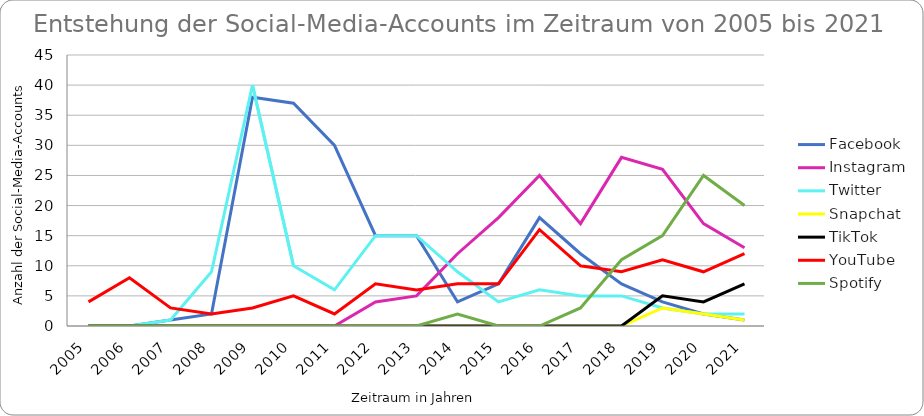
| Category | Facebook | Instagram | Twitter | Snapchat | TikTok | YouTube | Spotify |
|---|---|---|---|---|---|---|---|
| 2005.0 | 0 | 0 | 0 | 0 | 0 | 4 | 0 |
| 2006.0 | 0 | 0 | 0 | 0 | 0 | 8 | 0 |
| 2007.0 | 1 | 0 | 1 | 0 | 0 | 3 | 0 |
| 2008.0 | 2 | 0 | 9 | 0 | 0 | 2 | 0 |
| 2009.0 | 38 | 0 | 40 | 0 | 0 | 3 | 0 |
| 2010.0 | 37 | 0 | 10 | 0 | 0 | 5 | 0 |
| 2011.0 | 30 | 0 | 6 | 0 | 0 | 2 | 0 |
| 2012.0 | 15 | 4 | 15 | 0 | 0 | 7 | 0 |
| 2013.0 | 15 | 5 | 15 | 0 | 0 | 6 | 0 |
| 2014.0 | 4 | 12 | 9 | 0 | 0 | 7 | 2 |
| 2015.0 | 7 | 18 | 4 | 0 | 0 | 7 | 0 |
| 2016.0 | 18 | 25 | 6 | 0 | 0 | 16 | 0 |
| 2017.0 | 12 | 17 | 5 | 0 | 0 | 10 | 3 |
| 2018.0 | 7 | 28 | 5 | 0 | 0 | 9 | 11 |
| 2019.0 | 4 | 26 | 3 | 3 | 5 | 11 | 15 |
| 2020.0 | 2 | 17 | 2 | 2 | 4 | 9 | 25 |
| 2021.0 | 1 | 13 | 2 | 1 | 7 | 12 | 20 |